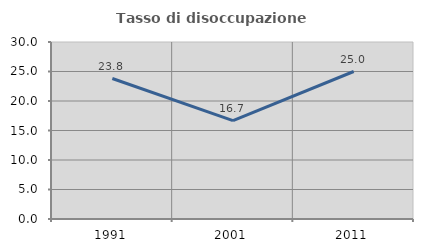
| Category | Tasso di disoccupazione giovanile  |
|---|---|
| 1991.0 | 23.81 |
| 2001.0 | 16.667 |
| 2011.0 | 25 |